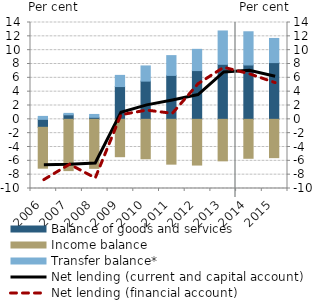
| Category | Balance of goods and services | Income balance | Transfer balance* |
|---|---|---|---|
| 2006.0 | -1.153 | -5.911 | 0.424 |
| 2007.0 | 0.656 | -7.413 | 0.206 |
| 2008.0 | 0.293 | -7.088 | 0.414 |
| 2009.0 | 4.738 | -5.403 | 1.616 |
| 2010.0 | 5.525 | -5.7 | 2.196 |
| 2011.0 | 6.351 | -6.48 | 2.861 |
| 2012.0 | 7.048 | -6.61 | 3.071 |
| 2013.0 | 7.954 | -6.001 | 4.822 |
| 2014.0 | 7.858 | -5.632 | 4.802 |
| 2015.0 | 8.202 | -5.541 | 3.491 |